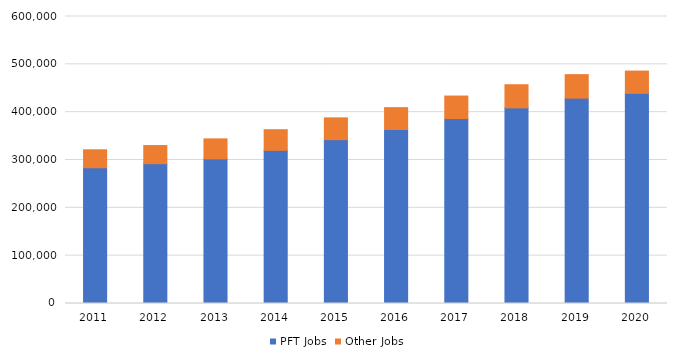
| Category | PFT Jobs | Other Jobs |
|---|---|---|
| 2011.0 | 283844 | 37504 |
| 2012.0 | 292307 | 37923 |
| 2013.0 | 302339 | 41833 |
| 2014.0 | 320153 | 43199 |
| 2015.0 | 342495 | 45577 |
| 2016.0 | 363732 | 45733 |
| 2017.0 | 386701 | 46982 |
| 2018.0 | 408988 | 48362 |
| 2019.0 | 429299 | 49151 |
| 2020.0 | 439382 | 46521 |